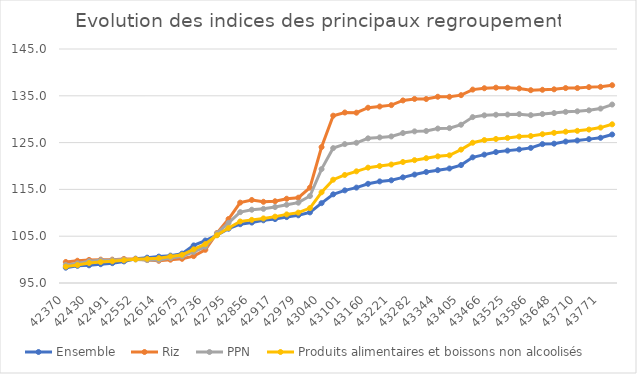
| Category |  Ensemble  |  Riz  |  PPN  |  Produits alimentaires et boissons non alcoolisés  |
|---|---|---|---|---|
| 2016-01-01 | 98.275 | 99.495 | 98.861 | 98.497 |
| 2016-02-01 | 98.669 | 99.754 | 99.183 | 98.836 |
| 2016-03-01 | 98.78 | 99.934 | 99.647 | 99.278 |
| 2016-04-01 | 99.017 | 99.994 | 99.867 | 99.476 |
| 2016-05-01 | 99.242 | 99.991 | 99.897 | 99.634 |
| 2016-06-01 | 99.614 | 100.144 | 100.021 | 99.851 |
| 2016-07-01 | 100.2 | 100.14 | 100.04 | 100.066 |
| 2016-08-01 | 100.412 | 99.904 | 99.904 | 100.159 |
| 2016-09-01 | 100.639 | 99.746 | 99.918 | 100.312 |
| 2016-10-01 | 100.848 | 99.979 | 100.318 | 100.675 |
| 2016-11-01 | 101.278 | 100.17 | 100.701 | 101.025 |
| 2016-12-01 | 103.026 | 100.747 | 101.643 | 102.191 |
| 2017-01-01 | 104.075 | 102.088 | 102.766 | 103.319 |
| 2017-02-01 | 105.227 | 105.671 | 105.604 | 105.201 |
| 2017-03-01 | 106.597 | 108.676 | 107.857 | 106.739 |
| 2017-04-01 | 107.562 | 112.176 | 110.14 | 108.143 |
| 2017-05-01 | 107.914 | 112.738 | 110.659 | 108.491 |
| 2017-06-01 | 108.397 | 112.351 | 110.843 | 108.798 |
| 2017-07-01 | 108.659 | 112.464 | 111.234 | 109.178 |
| 2017-08-01 | 109.085 | 113.002 | 111.719 | 109.659 |
| 2017-09-01 | 109.466 | 113.231 | 112.163 | 110.039 |
| 2017-10-01 | 110.085 | 115.374 | 113.583 | 111.008 |
| 2017-11-01 | 112.067 | 124.042 | 119.334 | 114.381 |
| 2017-12-01 | 113.945 | 130.752 | 123.824 | 117.072 |
| 2018-01-01 | 114.792 | 131.429 | 124.677 | 118.083 |
| 2018-02-01 | 115.382 | 131.39 | 124.962 | 118.86 |
| 2018-03-01 | 116.197 | 132.45 | 125.908 | 119.648 |
| 2018-04-01 | 116.708 | 132.716 | 126.112 | 119.992 |
| 2018-05-01 | 116.945 | 133.005 | 126.317 | 120.318 |
| 2018-06-01 | 117.574 | 134.006 | 127.039 | 120.852 |
| 2018-07-01 | 118.169 | 134.333 | 127.399 | 121.251 |
| 2018-08-01 | 118.716 | 134.315 | 127.482 | 121.67 |
| 2018-09-01 | 119.112 | 134.797 | 128.002 | 122.064 |
| 2018-10-01 | 119.471 | 134.79 | 128.09 | 122.277 |
| 2018-11-01 | 120.196 | 135.136 | 128.817 | 123.5 |
| 2018-12-01 | 121.856 | 136.326 | 130.448 | 124.972 |
| 2019-01-01 | 122.431 | 136.617 | 130.824 | 125.539 |
| 2019-02-01 | 122.976 | 136.743 | 130.947 | 125.775 |
| 2019-03-01 | 123.287 | 136.724 | 130.988 | 126.003 |
| 2019-04-01 | 123.539 | 136.57 | 131.08 | 126.288 |
| 2019-05-01 | 123.87 | 136.199 | 130.864 | 126.405 |
| 2019-06-01 | 124.678 | 136.285 | 131.1 | 126.791 |
| 2019-07-02 | 124.773 | 136.384 | 131.306 | 127.081 |
| 2019-08-02 | 125.224 | 136.653 | 131.568 | 127.335 |
| 2019-09-02 | 125.442 | 136.653 | 131.684 | 127.515 |
| 2019-10-02 | 125.743 | 136.854 | 131.892 | 127.783 |
| 2019-11-02 | 126.03 | 136.915 | 132.269 | 128.209 |
| 2019-12-02 | 126.732 | 137.262 | 133.132 | 128.908 |